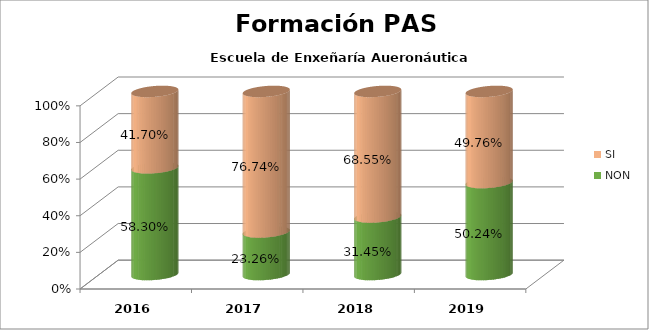
| Category | NON | SI |
|---|---|---|
| 2016.0 | 0.583 | 0.417 |
| 2017.0 | 0.233 | 0.767 |
| 2018.0 | 0.314 | 0.686 |
| 2019.0 | 0.502 | 0.498 |